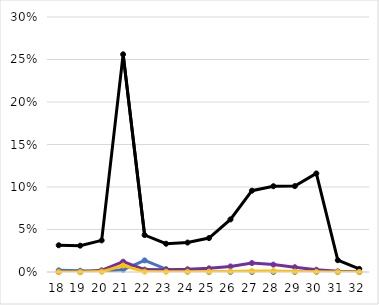
| Category | Total | miRNAs | TE | Virus |
|---|---|---|---|---|
| 18.0 | 0.031 | 0.002 | 0 | 0 |
| 19.0 | 0.031 | 0.001 | 0 | 0 |
| 20.0 | 0.037 | 0.001 | 0.002 | 0 |
| 21.0 | 0.256 | 0.003 | 0.012 | 0.008 |
| 22.0 | 0.043 | 0.014 | 0.003 | 0 |
| 23.0 | 0.033 | 0.003 | 0.003 | 0 |
| 24.0 | 0.035 | 0 | 0.003 | 0 |
| 25.0 | 0.04 | 0 | 0.004 | 0 |
| 26.0 | 0.062 | 0 | 0.007 | 0.001 |
| 27.0 | 0.096 | 0 | 0.011 | 0.001 |
| 28.0 | 0.101 | 0 | 0.009 | 0.001 |
| 29.0 | 0.101 | 0 | 0.006 | 0.001 |
| 30.0 | 0.116 | 0 | 0.003 | 0 |
| 31.0 | 0.014 | 0 | 0.001 | 0 |
| 32.0 | 0.004 | 0 | 0 | 0 |